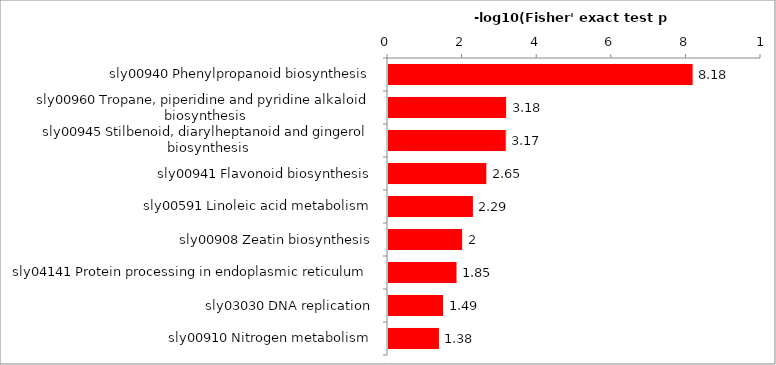
| Category | Series 0 |
|---|---|
| sly00940 Phenylpropanoid biosynthesis | 8.18 |
| sly00960 Tropane, piperidine and pyridine alkaloid biosynthesis | 3.18 |
| sly00945 Stilbenoid, diarylheptanoid and gingerol biosynthesis | 3.17 |
| sly00941 Flavonoid biosynthesis | 2.65 |
| sly00591 Linoleic acid metabolism | 2.29 |
| sly00908 Zeatin biosynthesis | 2 |
| sly04141 Protein processing in endoplasmic reticulum | 1.85 |
| sly03030 DNA replication | 1.49 |
| sly00910 Nitrogen metabolism | 1.38 |